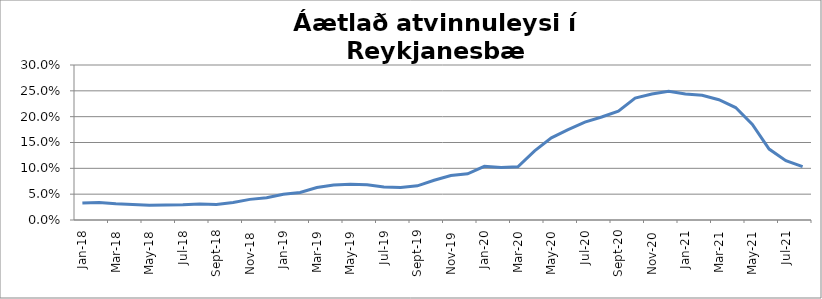
| Category | Series 0 |
|---|---|
| 2018-01-01 | 0.033 |
| 2018-02-01 | 0.034 |
| 2018-03-01 | 0.031 |
| 2018-04-01 | 0.03 |
| 2018-05-01 | 0.028 |
| 2018-06-01 | 0.029 |
| 2018-07-01 | 0.03 |
| 2018-08-01 | 0.031 |
| 2018-09-01 | 0.03 |
| 2018-10-01 | 0.034 |
| 2018-11-01 | 0.04 |
| 2018-12-01 | 0.043 |
| 2019-01-01 | 0.05 |
| 2019-02-01 | 0.053 |
| 2019-03-01 | 0.063 |
| 2019-04-01 | 0.068 |
| 2019-05-01 | 0.069 |
| 2019-06-01 | 0.068 |
| 2019-07-01 | 0.064 |
| 2019-08-01 | 0.063 |
| 2019-09-01 | 0.066 |
| 2019-10-01 | 0.077 |
| 2019-11-01 | 0.086 |
| 2019-12-01 | 0.089 |
| 2020-01-01 | 0.104 |
| 2020-02-01 | 0.102 |
| 2020-03-01 | 0.103 |
| 2020-04-01 | 0.134 |
| 2020-05-01 | 0.159 |
| 2020-06-01 | 0.175 |
| 2020-07-01 | 0.189 |
| 2020-08-01 | 0.199 |
| 2020-09-01 | 0.21 |
| 2020-10-01 | 0.236 |
| 2020-11-01 | 0.244 |
| 2020-12-01 | 0.249 |
| 2021-01-01 | 0.244 |
| 2021-02-01 | 0.242 |
| 2021-03-01 | 0.233 |
| 2021-04-01 | 0.218 |
| 2021-05-01 | 0.185 |
| 2021-06-01 | 0.137 |
| 2021-07-01 | 0.115 |
| 2021-08-01 | 0.103 |